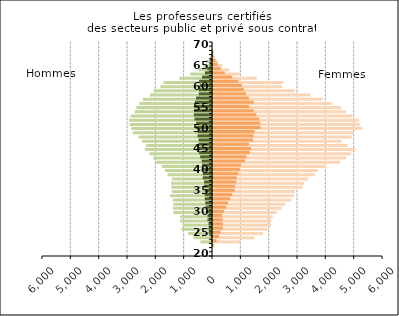
| Category | Femmes public | Femmes privé |
|---|---|---|
| 20.0 | 0 | 0 |
| 21.0 | 2 | 0 |
| 22.0 | 53 | 14 |
| 23.0 | 965 | 126 |
| 24.0 | 1458 | 212 |
| 25.0 | 1768 | 270 |
| 26.0 | 1922 | 350 |
| 27.0 | 2045 | 355 |
| 28.0 | 2062 | 343 |
| 29.0 | 2110 | 328 |
| 30.0 | 2252 | 395 |
| 31.0 | 2429 | 473 |
| 32.0 | 2553 | 531 |
| 33.0 | 2762 | 608 |
| 34.0 | 2869 | 675 |
| 35.0 | 2886 | 768 |
| 36.0 | 3167 | 783 |
| 37.0 | 3218 | 822 |
| 38.0 | 3358 | 839 |
| 39.0 | 3596 | 898 |
| 40.0 | 3704 | 947 |
| 41.0 | 4001 | 985 |
| 42.0 | 4473 | 1135 |
| 43.0 | 4695 | 1180 |
| 44.0 | 4879 | 1298 |
| 45.0 | 5040 | 1343 |
| 46.0 | 4748 | 1267 |
| 47.0 | 4532 | 1409 |
| 48.0 | 4891 | 1430 |
| 49.0 | 4944 | 1477 |
| 50.0 | 5269 | 1680 |
| 51.0 | 5183 | 1670 |
| 52.0 | 5156 | 1634 |
| 53.0 | 4913 | 1525 |
| 54.0 | 4698 | 1433 |
| 55.0 | 4517 | 1280 |
| 56.0 | 4212 | 1440 |
| 57.0 | 3877 | 1264 |
| 58.0 | 3443 | 1161 |
| 59.0 | 2890 | 1094 |
| 60.0 | 2441 | 1020 |
| 61.0 | 2467 | 899 |
| 62.0 | 1543 | 678 |
| 63.0 | 936 | 416 |
| 64.0 | 573 | 273 |
| 65.0 | 336 | 165 |
| 66.0 | 187 | 87 |
| 67.0 | 55 | 20 |
| 68.0 | 16 | 7 |
| 69.0 | 1 | 0 |
| 70.0 | 0 | 0 |